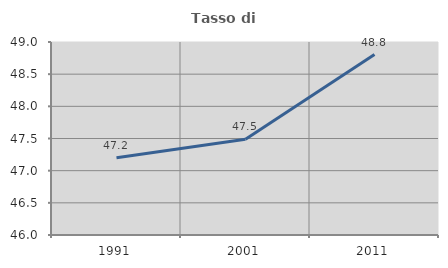
| Category | Tasso di occupazione   |
|---|---|
| 1991.0 | 47.201 |
| 2001.0 | 47.487 |
| 2011.0 | 48.806 |